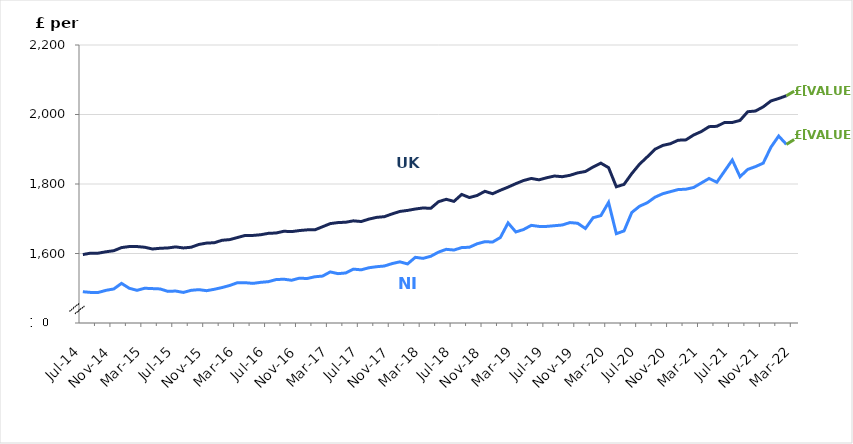
| Category | Series 0 | Series 1 |
|---|---|---|
| 2014-07-01 | 1490 | 1597 |
| 2014-08-01 | 1488 | 1601 |
| 2014-09-01 | 1488 | 1601 |
| 2014-10-01 | 1494 | 1605 |
| 2014-11-01 | 1498 | 1608 |
| 2014-12-01 | 1514 | 1617 |
| 2015-01-01 | 1500 | 1620 |
| 2015-02-01 | 1494 | 1620 |
| 2015-03-01 | 1500 | 1618 |
| 2015-04-01 | 1499 | 1613 |
| 2015-05-01 | 1498 | 1615 |
| 2015-06-01 | 1491 | 1616 |
| 2015-07-01 | 1492 | 1619 |
| 2015-08-01 | 1488 | 1616 |
| 2015-09-01 | 1494 | 1618 |
| 2015-10-01 | 1496 | 1626 |
| 2015-11-01 | 1493 | 1630 |
| 2015-12-01 | 1497 | 1631 |
| 2016-01-01 | 1502 | 1638 |
| 2016-02-01 | 1508 | 1640 |
| 2016-03-01 | 1516 | 1646 |
| 2016-04-01 | 1516 | 1652 |
| 2016-05-01 | 1514 | 1652 |
| 2016-06-01 | 1517 | 1654 |
| 2016-07-01 | 1519 | 1658 |
| 2016-08-01 | 1525 | 1659 |
| 2016-09-01 | 1526 | 1664 |
| 2016-10-01 | 1523 | 1663 |
| 2016-11-01 | 1529 | 1666 |
| 2016-12-01 | 1528 | 1668 |
| 2017-01-01 | 1533 | 1668 |
| 2017-02-01 | 1535 | 1677 |
| 2017-03-01 | 1547 | 1686 |
| 2017-04-01 | 1542 | 1689 |
| 2017-05-01 | 1544 | 1690 |
| 2017-06-01 | 1555 | 1694 |
| 2017-07-01 | 1553 | 1692 |
| 2017-08-01 | 1559 | 1699 |
| 2017-09-01 | 1562 | 1704 |
| 2017-10-01 | 1564 | 1706 |
| 2017-11-01 | 1571 | 1714 |
| 2017-12-01 | 1576 | 1721 |
| 2018-01-01 | 1570 | 1724 |
| 2018-02-01 | 1589 | 1728 |
| 2018-03-01 | 1586 | 1731 |
| 2018-04-01 | 1592 | 1730 |
| 2018-05-01 | 1604 | 1749 |
| 2018-06-01 | 1612 | 1756 |
| 2018-07-01 | 1610 | 1750 |
| 2018-08-01 | 1617 | 1770 |
| 2018-09-01 | 1618 | 1761 |
| 2018-10-01 | 1628 | 1767 |
| 2018-11-01 | 1634 | 1779 |
| 2018-12-01 | 1633 | 1772 |
| 2019-01-01 | 1646 | 1782 |
| 2019-02-01 | 1688 | 1791 |
| 2019-03-01 | 1662 | 1801 |
| 2019-04-01 | 1669 | 1810 |
| 2019-05-01 | 1681 | 1816 |
| 2019-06-01 | 1678 | 1812 |
| 2019-07-01 | 1678 | 1818 |
| 2019-08-01 | 1680 | 1823 |
| 2019-09-01 | 1682 | 1821 |
| 2019-10-01 | 1689 | 1825 |
| 2019-11-01 | 1687 | 1832 |
| 2019-12-01 | 1672 | 1836 |
| 2020-01-01 | 1703 | 1849 |
| 2020-02-01 | 1709 | 1860 |
| 2020-03-01 | 1747 | 1847 |
| 2020-04-01 | 1657 | 1792 |
| 2020-05-01 | 1665 | 1799 |
| 2020-06-01 | 1718 | 1830 |
| 2020-07-01 | 1736 | 1857 |
| 2020-08-01 | 1746 | 1878 |
| 2020-09-01 | 1762 | 1900 |
| 2020-10-01 | 1772 | 1911 |
| 2020-11-01 | 1778 | 1916 |
| 2020-12-01 | 1784 | 1926 |
| 2021-01-01 | 1785 | 1927 |
| 2021-02-01 | 1790 | 1941 |
| 2021-03-01 | 1803 | 1951 |
| 2021-04-01 | 1816 | 1965 |
| 2021-05-01 | 1805 | 1966 |
| 2021-06-01 | 1837 | 1977 |
| 2021-07-01 | 1869 | 1977 |
| 2021-08-01 | 1821 | 1983 |
| 2021-09-01 | 1842 | 2008 |
| 2021-10-01 | 1850 | 2010 |
| 2021-11-01 | 1860 | 2022 |
| 2021-12-01 | 1906 | 2039 |
| 2022-01-01 | 1938 | 2046 |
| 2022-02-01 | 1914 | 2054 |
| 2022-03-01 | 1928 | 2067 |